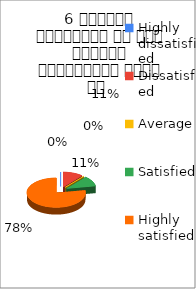
| Category | 6 शिक्षक समयनिष्ट है एवं नियमित व्याख्यान देते है  |
|---|---|
| Highly dissatisfied | 0 |
| Dissatisfied | 1 |
| Average | 0 |
| Satisfied | 1 |
| Highly satisfied | 7 |